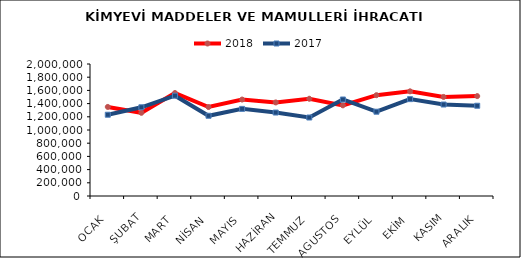
| Category | 2018 | 2017 |
|---|---|---|
| OCAK | 1349545.934 | 1231388.721 |
| ŞUBAT | 1260258.855 | 1344226.022 |
| MART | 1560072.297 | 1519751.429 |
| NİSAN | 1348083.618 | 1215596.084 |
| MAYIS | 1461305.797 | 1319978.486 |
| HAZİRAN | 1417700.62 | 1264562.906 |
| TEMMUZ | 1473383.517 | 1189186.923 |
| AGUSTOS | 1373648.483 | 1462333.739 |
| EYLÜL | 1527438.905 | 1277014.878 |
| EKİM | 1585985.946 | 1467694.257 |
| KASIM | 1501182.747 | 1386116.467 |
| ARALIK | 1513510.478 | 1367495.762 |